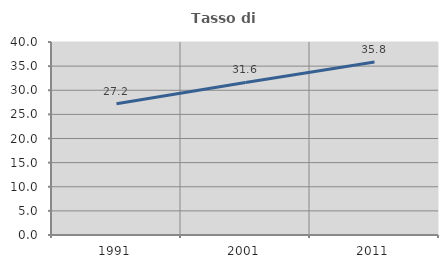
| Category | Tasso di occupazione   |
|---|---|
| 1991.0 | 27.218 |
| 2001.0 | 31.625 |
| 2011.0 | 35.843 |